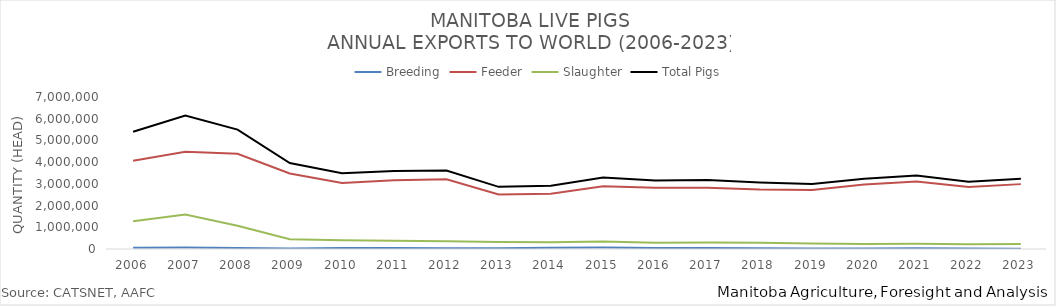
| Category | Breeding | Feeder | Slaughter | Total Pigs |
|---|---|---|---|---|
| 2006 | 59105 | 4066357 | 1276288 | 5401750 |
| 2007 | 73298 | 4479810 | 1593357 | 6146465 |
| 2008 | 48103 | 4383172 | 1069622 | 5500897 |
| 2009 | 28439 | 3478459 | 453389 | 3960287 |
| 2010 | 44967 | 3042429 | 406800 | 3494196 |
| 2011 | 50828 | 3161424 | 377265 | 3589517 |
| 2012 | 39038 | 3212162 | 358564 | 3609764 |
| 2013 | 30677 | 2513275 | 317445 | 2861397 |
| 2014 | 62427 | 2546167 | 308748 | 2917342 |
| 2015 | 63892 | 2887052 | 341008 | 3291952 |
| 2016 | 50322 | 2821605 | 286910 | 3158837 |
| 2017 | 47613 | 2825456 | 300591 | 3173660 |
| 2018 | 33135 | 2738801 | 287995 | 3059931 |
| 2019 | 22283 | 2713769 | 258640 | 2994692 |
| 2020 | 26017 | 2973459 | 234293 | 3233769 |
| 2021 | 31143 | 3113866 | 240883 | 3385892 |
| 2022 | 18448 | 2854505 | 223579 | 3096532 |
| 2023 | 12606 | 2987627 | 229623 | 3229856 |